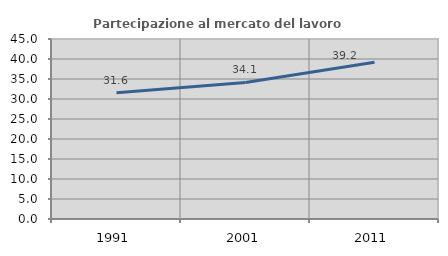
| Category | Partecipazione al mercato del lavoro  femminile |
|---|---|
| 1991.0 | 31.588 |
| 2001.0 | 34.138 |
| 2011.0 | 39.195 |